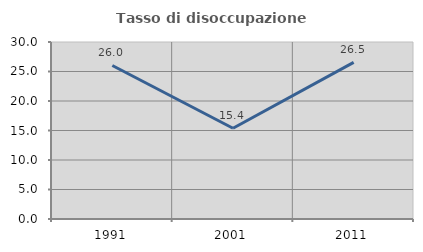
| Category | Tasso di disoccupazione giovanile  |
|---|---|
| 1991.0 | 26.022 |
| 2001.0 | 15.385 |
| 2011.0 | 26.543 |